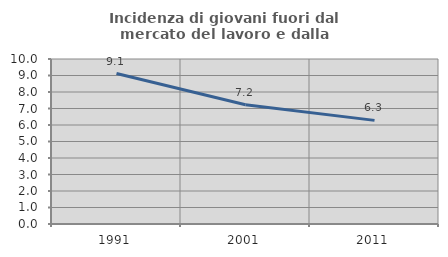
| Category | Incidenza di giovani fuori dal mercato del lavoro e dalla formazione  |
|---|---|
| 1991.0 | 9.117 |
| 2001.0 | 7.228 |
| 2011.0 | 6.28 |